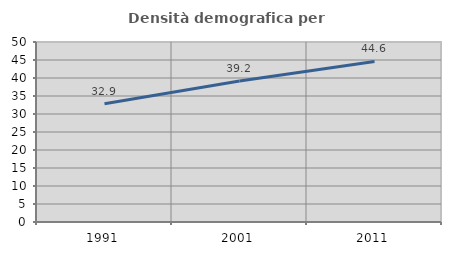
| Category | Densità demografica |
|---|---|
| 1991.0 | 32.851 |
| 2001.0 | 39.156 |
| 2011.0 | 44.596 |